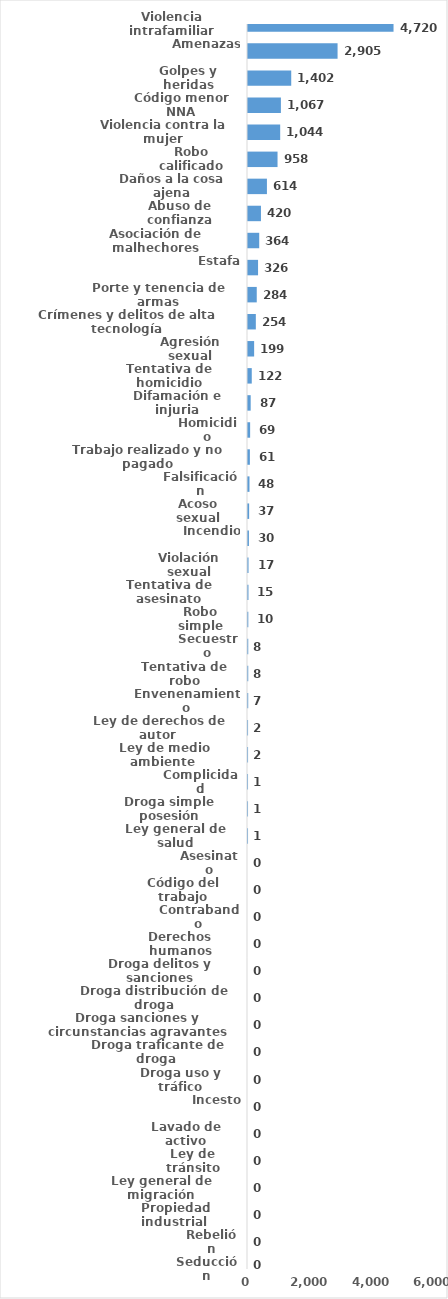
| Category | Series 0 |
|---|---|
| Violencia intrafamiliar | 4720 |
| Amenazas | 2905 |
| Golpes y heridas | 1402 |
| Código menor NNA | 1067 |
| Violencia contra la mujer | 1044 |
| Robo calificado | 958 |
| Daños a la cosa ajena | 614 |
| Abuso de confianza | 420 |
| Asociación de malhechores | 364 |
| Estafa | 326 |
| Porte y tenencia de armas | 284 |
| Crímenes y delitos de alta tecnología | 254 |
| Agresión sexual | 199 |
| Tentativa de homicidio | 122 |
| Difamación e injuria | 87 |
| Homicidio | 69 |
| Trabajo realizado y no pagado | 61 |
| Falsificación | 48 |
| Acoso sexual | 37 |
| Incendio | 30 |
| Violación sexual | 17 |
| Tentativa de asesinato | 15 |
| Robo simple | 10 |
| Secuestro | 8 |
| Tentativa de robo | 8 |
| Envenenamiento | 7 |
| Ley de derechos de autor  | 2 |
| Ley de medio ambiente  | 2 |
| Complicidad | 1 |
| Droga simple posesión | 1 |
| Ley general de salud | 1 |
| Asesinato | 0 |
| Código del trabajo | 0 |
| Contrabando | 0 |
| Derechos humanos | 0 |
| Droga delitos y sanciones | 0 |
| Droga distribución de droga | 0 |
| Droga sanciones y circunstancias agravantes | 0 |
| Droga traficante de droga  | 0 |
| Droga uso y tráfico | 0 |
| Incesto | 0 |
| Lavado de activo | 0 |
| Ley de tránsito | 0 |
| Ley general de migración | 0 |
| Propiedad industrial  | 0 |
| Rebelión | 0 |
| Seducción | 0 |